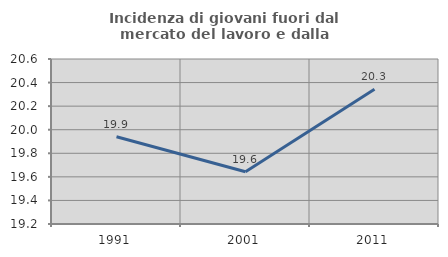
| Category | Incidenza di giovani fuori dal mercato del lavoro e dalla formazione  |
|---|---|
| 1991.0 | 19.941 |
| 2001.0 | 19.643 |
| 2011.0 | 20.343 |